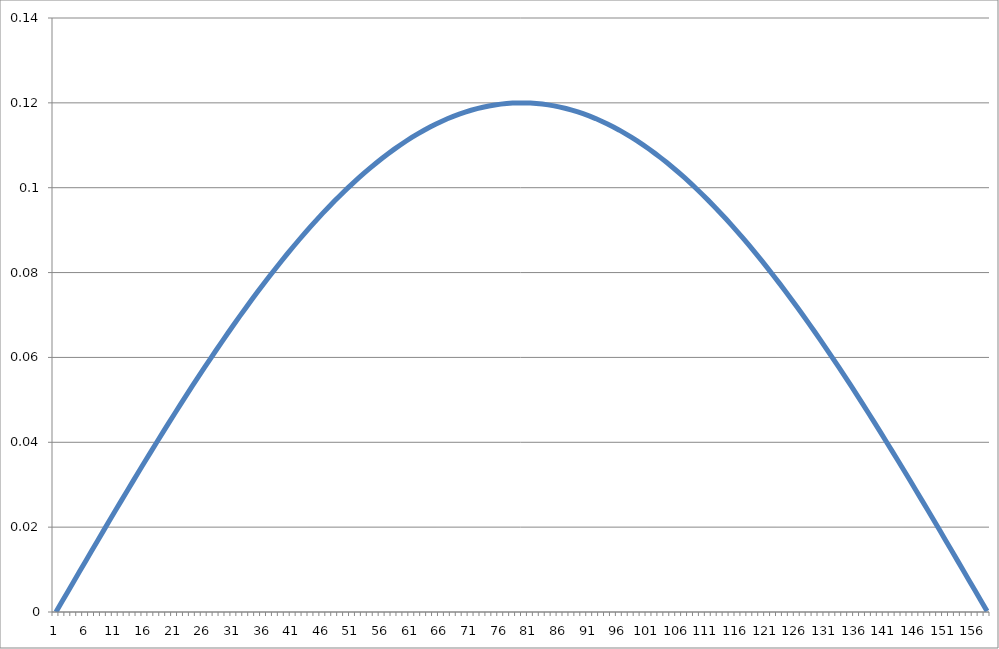
| Category | Series 0 |
|---|---|
| 0 | 0 |
| 1 | 0.002 |
| 2 | 0.005 |
| 3 | 0.007 |
| 4 | 0.01 |
| 5 | 0.012 |
| 6 | 0.014 |
| 7 | 0.017 |
| 8 | 0.019 |
| 9 | 0.021 |
| 10 | 0.024 |
| 11 | 0.026 |
| 12 | 0.029 |
| 13 | 0.031 |
| 14 | 0.033 |
| 15 | 0.035 |
| 16 | 0.038 |
| 17 | 0.04 |
| 18 | 0.042 |
| 19 | 0.045 |
| 20 | 0.047 |
| 21 | 0.049 |
| 22 | 0.051 |
| 23 | 0.053 |
| 24 | 0.055 |
| 25 | 0.058 |
| 26 | 0.06 |
| 27 | 0.062 |
| 28 | 0.064 |
| 29 | 0.066 |
| 30 | 0.068 |
| 31 | 0.07 |
| 32 | 0.072 |
| 33 | 0.074 |
| 34 | 0.075 |
| 35 | 0.077 |
| 36 | 0.079 |
| 37 | 0.081 |
| 38 | 0.083 |
| 39 | 0.084 |
| 40 | 0.086 |
| 41 | 0.088 |
| 42 | 0.089 |
| 43 | 0.091 |
| 44 | 0.092 |
| 45 | 0.094 |
| 46 | 0.095 |
| 47 | 0.097 |
| 48 | 0.098 |
| 49 | 0.1 |
| 50 | 0.101 |
| 51 | 0.102 |
| 52 | 0.103 |
| 53 | 0.105 |
| 54 | 0.106 |
| 55 | 0.107 |
| 56 | 0.108 |
| 57 | 0.109 |
| 58 | 0.11 |
| 59 | 0.111 |
| 60 | 0.112 |
| 61 | 0.113 |
| 62 | 0.113 |
| 63 | 0.114 |
| 64 | 0.115 |
| 65 | 0.116 |
| 66 | 0.116 |
| 67 | 0.117 |
| 68 | 0.117 |
| 69 | 0.118 |
| 70 | 0.118 |
| 71 | 0.119 |
| 72 | 0.119 |
| 73 | 0.119 |
| 74 | 0.12 |
| 75 | 0.12 |
| 76 | 0.12 |
| 77 | 0.12 |
| 78 | 0.12 |
| 79 | 0.12 |
| 80 | 0.12 |
| 81 | 0.12 |
| 82 | 0.12 |
| 83 | 0.12 |
| 84 | 0.119 |
| 85 | 0.119 |
| 86 | 0.119 |
| 87 | 0.118 |
| 88 | 0.118 |
| 89 | 0.117 |
| 90 | 0.117 |
| 91 | 0.116 |
| 92 | 0.116 |
| 93 | 0.115 |
| 94 | 0.114 |
| 95 | 0.114 |
| 96 | 0.113 |
| 97 | 0.112 |
| 98 | 0.111 |
| 99 | 0.11 |
| 100 | 0.109 |
| 101 | 0.108 |
| 102 | 0.107 |
| 103 | 0.106 |
| 104 | 0.105 |
| 105 | 0.104 |
| 106 | 0.102 |
| 107 | 0.101 |
| 108 | 0.1 |
| 109 | 0.098 |
| 110 | 0.097 |
| 111 | 0.096 |
| 112 | 0.094 |
| 113 | 0.093 |
| 114 | 0.091 |
| 115 | 0.089 |
| 116 | 0.088 |
| 117 | 0.086 |
| 118 | 0.085 |
| 119 | 0.083 |
| 120 | 0.081 |
| 121 | 0.079 |
| 122 | 0.077 |
| 123 | 0.076 |
| 124 | 0.074 |
| 125 | 0.072 |
| 126 | 0.07 |
| 127 | 0.068 |
| 128 | 0.066 |
| 129 | 0.064 |
| 130 | 0.062 |
| 131 | 0.06 |
| 132 | 0.058 |
| 133 | 0.056 |
| 134 | 0.053 |
| 135 | 0.051 |
| 136 | 0.049 |
| 137 | 0.047 |
| 138 | 0.045 |
| 139 | 0.042 |
| 140 | 0.04 |
| 141 | 0.038 |
| 142 | 0.036 |
| 143 | 0.033 |
| 144 | 0.031 |
| 145 | 0.029 |
| 146 | 0.026 |
| 147 | 0.024 |
| 148 | 0.022 |
| 149 | 0.019 |
| 150 | 0.017 |
| 151 | 0.015 |
| 152 | 0.012 |
| 153 | 0.01 |
| 154 | 0.007 |
| 155 | 0.005 |
| 156 | 0.003 |
| 157 | 0 |